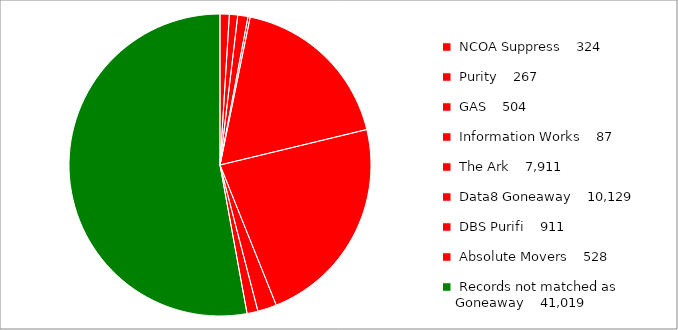
| Category | Series 0 |
|---|---|
| 0 | 611 |
| 1 | 549 |
| 2 | 673 |
| 3 | 144 |
| 4 | 11116 |
| 5 | 13999 |
| 6 | 1257 |
| 7 | 721 |
| 8 | 32610 |